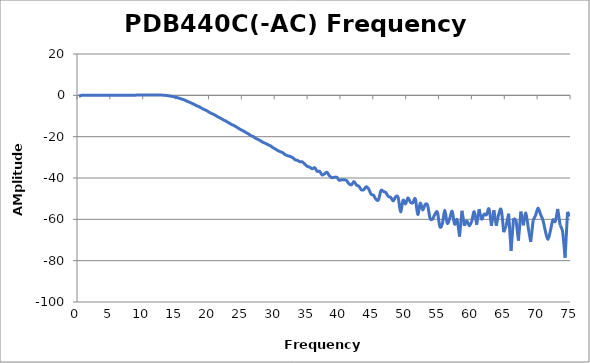
| Category | Series 0 |
|---|---|
| 0.3 | -0.463 |
| 0.6735 | -0.023 |
| 1.047 | 0.062 |
| 1.4205 | 0.02 |
| 1.794 | 0.02 |
| 2.1675 | 0.028 |
| 2.541 | 0.044 |
| 2.9145 | 0.028 |
| 3.288 | 0.047 |
| 3.6615 | 0.043 |
| 4.035 | 0.022 |
| 4.4085 | 0.026 |
| 4.782 | 0.03 |
| 5.1555 | 0.042 |
| 5.529 | 0.03 |
| 5.9025 | 0.036 |
| 6.276 | 0.018 |
| 6.6495 | 0.045 |
| 7.023 | 0.035 |
| 7.3965 | 0.045 |
| 7.77 | 0.056 |
| 8.1435 | 0.058 |
| 8.517 | 0.07 |
| 8.8905 | 0.092 |
| 9.264 | 0.118 |
| 9.6375 | 0.144 |
| 10.011 | 0.172 |
| 10.3845 | 0.176 |
| 10.758 | 0.212 |
| 11.1315 | 0.217 |
| 11.505 | 0.218 |
| 11.8785 | 0.207 |
| 12.252 | 0.189 |
| 12.6255 | 0.158 |
| 12.999 | 0.096 |
| 13.3725 | 0.006 |
| 13.746 | -0.127 |
| 14.1195 | -0.313 |
| 14.493 | -0.53 |
| 14.8665 | -0.795 |
| 15.24 | -1.105 |
| 15.6135 | -1.465 |
| 15.987 | -1.871 |
| 16.3605 | -2.249 |
| 16.734 | -2.829 |
| 17.1075 | -3.327 |
| 17.481 | -3.868 |
| 17.8545 | -4.438 |
| 18.228 | -5.109 |
| 18.6015 | -5.542 |
| 18.975 | -6.269 |
| 19.3485 | -6.889 |
| 19.722 | -7.366 |
| 20.0955 | -8.15 |
| 20.469 | -8.765 |
| 20.8425 | -9.29 |
| 21.216 | -10.004 |
| 21.5895 | -10.691 |
| 21.963 | -11.293 |
| 22.3365 | -11.972 |
| 22.71 | -12.583 |
| 23.0835 | -13.308 |
| 23.457 | -14.002 |
| 23.8305 | -14.565 |
| 24.204 | -15.209 |
| 24.5775 | -15.989 |
| 24.951 | -16.675 |
| 25.3245 | -17.272 |
| 25.698 | -18 |
| 26.0715 | -18.662 |
| 26.445 | -19.5 |
| 26.8185 | -19.97 |
| 27.192 | -20.827 |
| 27.5655 | -21.347 |
| 27.939 | -22.037 |
| 28.3125 | -22.765 |
| 28.686 | -23.255 |
| 29.0595 | -23.912 |
| 29.433 | -24.445 |
| 29.8065 | -25.294 |
| 30.18 | -25.999 |
| 30.5535 | -26.728 |
| 30.927 | -27.265 |
| 31.3005 | -27.781 |
| 31.674 | -28.72 |
| 32.0475 | -29.234 |
| 32.421 | -29.554 |
| 32.7945 | -30.114 |
| 33.168 | -31.14 |
| 33.5415 | -31.501 |
| 33.915 | -32.139 |
| 34.2885 | -32.22 |
| 34.662 | -33.333 |
| 35.0355 | -34.355 |
| 35.409 | -34.787 |
| 35.7825 | -35.545 |
| 36.156 | -35.006 |
| 36.5295 | -36.759 |
| 36.903 | -36.739 |
| 37.2765 | -38.484 |
| 37.65 | -37.996 |
| 38.0235 | -37.221 |
| 38.397 | -38.922 |
| 38.7705 | -39.851 |
| 39.144 | -39.664 |
| 39.5175 | -39.671 |
| 39.891 | -41.081 |
| 40.2645 | -40.857 |
| 40.638 | -40.81 |
| 41.0115 | -41.243 |
| 41.385 | -42.837 |
| 41.7585 | -43.284 |
| 42.132 | -41.727 |
| 42.5055 | -43.367 |
| 42.879 | -44.008 |
| 43.2525 | -45.678 |
| 43.626 | -45.656 |
| 43.9995 | -44.196 |
| 44.373 | -45.331 |
| 44.7465 | -47.836 |
| 45.12 | -48.39 |
| 45.4935 | -50.356 |
| 45.867 | -50.535 |
| 46.2405 | -46.109 |
| 46.614 | -46.488 |
| 46.9875 | -47.085 |
| 47.361 | -48.88 |
| 47.7345 | -49.427 |
| 48.108 | -51.1 |
| 48.4815 | -49.085 |
| 48.855 | -49.422 |
| 49.2285 | -56.321 |
| 49.602 | -50.79 |
| 49.9755 | -52.529 |
| 50.349 | -49.586 |
| 50.7225 | -51.744 |
| 51.096 | -51.988 |
| 51.4695 | -50.08 |
| 51.843 | -57.628 |
| 52.2165 | -52.197 |
| 52.59 | -55.452 |
| 52.9635 | -52.845 |
| 53.337 | -53.191 |
| 53.7105 | -59.499 |
| 54.084 | -59.855 |
| 54.4575 | -57.546 |
| 54.831 | -56.597 |
| 55.2045 | -63.542 |
| 55.578 | -62.112 |
| 55.9515 | -55.593 |
| 56.325 | -61.861 |
| 56.6985 | -59.488 |
| 57.072 | -56.093 |
| 57.4455 | -62.343 |
| 57.819 | -60.155 |
| 58.1925 | -68.341 |
| 58.566 | -55.847 |
| 58.9395 | -63.159 |
| 59.313 | -60.739 |
| 59.6865 | -63.111 |
| 60.06 | -60.8 |
| 60.4335 | -56.292 |
| 60.807 | -62.611 |
| 61.1805 | -55.073 |
| 61.554 | -59.847 |
| 61.9275 | -57.527 |
| 62.301 | -57.798 |
| 62.6745 | -54.97 |
| 63.048 | -63.128 |
| 63.4215 | -55.597 |
| 63.795 | -63.107 |
| 64.1685 | -57.419 |
| 64.542 | -55.456 |
| 64.9155 | -66.228 |
| 65.289 | -63.105 |
| 65.6625 | -57.279 |
| 66.036 | -75.286 |
| 66.4095 | -59.591 |
| 66.783 | -60.21 |
| 67.1565 | -70.31 |
| 67.53 | -56.23 |
| 67.9035 | -62.919 |
| 68.277 | -56.935 |
| 68.6505 | -64.14 |
| 69.024 | -70.884 |
| 69.3975 | -60.431 |
| 69.771 | -57.997 |
| 70.1445 | -54.577 |
| 70.518 | -57.595 |
| 70.8915 | -60.509 |
| 71.265 | -65.874 |
| 71.6385 | -69.712 |
| 72.012 | -65.636 |
| 72.3855 | -60.362 |
| 72.759 | -60.989 |
| 73.1325 | -54.966 |
| 73.506 | -62.933 |
| 73.8795 | -66.122 |
| 74.253 | -78.568 |
| 74.6265 | -56.409 |
| 75.0 | -58.493 |